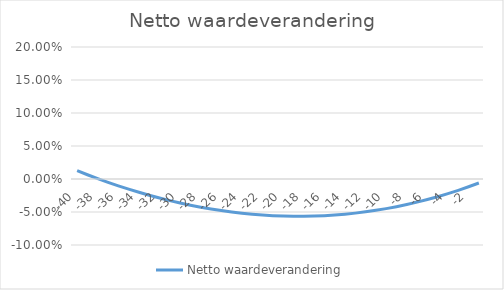
| Category | Netto waardeverandering |
|---|---|
| -40.0 | 0.013 |
| -39.0 | 0.006 |
| -38.0 | 0.001 |
| -37.0 | -0.005 |
| -36.0 | -0.01 |
| -35.0 | -0.015 |
| -34.0 | -0.02 |
| -33.0 | -0.025 |
| -32.0 | -0.029 |
| -31.0 | -0.033 |
| -30.0 | -0.036 |
| -29.0 | -0.04 |
| -28.0 | -0.043 |
| -27.0 | -0.045 |
| -26.0 | -0.048 |
| -25.0 | -0.05 |
| -24.0 | -0.052 |
| -23.0 | -0.053 |
| -22.0 | -0.055 |
| -21.0 | -0.056 |
| -20.0 | -0.056 |
| -19.0 | -0.057 |
| -18.0 | -0.057 |
| -17.0 | -0.056 |
| -16.0 | -0.056 |
| -15.0 | -0.055 |
| -14.0 | -0.053 |
| -13.0 | -0.052 |
| -12.0 | -0.05 |
| -11.0 | -0.048 |
| -10.0 | -0.045 |
| -9.0 | -0.042 |
| -8.0 | -0.039 |
| -7.0 | -0.035 |
| -6.0 | -0.031 |
| -5.0 | -0.027 |
| -4.0 | -0.022 |
| -3.0 | -0.017 |
| -2.0 | -0.012 |
| -1.0 | -0.006 |